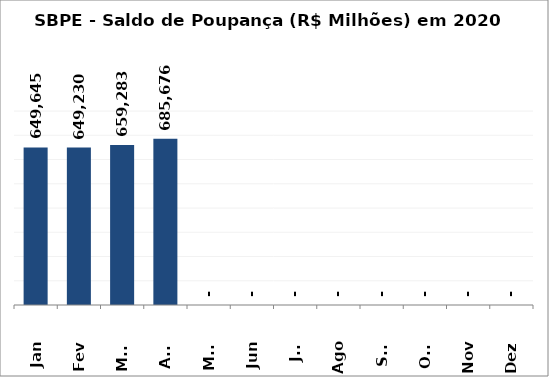
| Category | SBPE - Saldo de Poupança (R$ Milhões) em 2020 |
|---|---|
| Jan | 649645.04 |
| Fev | 649229.63 |
| Mar | 659283.469 |
| Abr | 685675.702 |
| Mai | 0 |
| Jun | 0 |
| Jul | 0 |
| Ago | 0 |
| Set | 0 |
| Out | 0 |
| Nov | 0 |
| Dez | 0 |